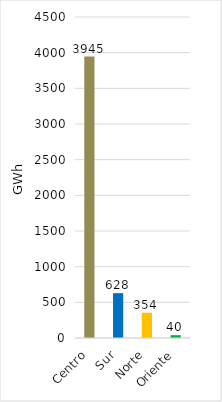
| Category | Series 0 |
|---|---|
| Centro | 3945.176 |
| Sur | 628.488 |
| Norte | 354.254 |
| Oriente | 39.648 |